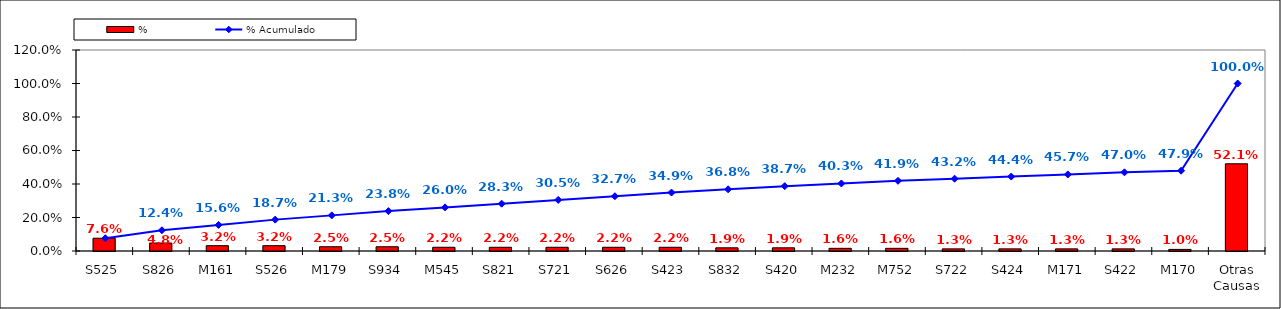
| Category | % |
|---|---|
| S525 | 0.076 |
| S826 | 0.048 |
| M161 | 0.032 |
| S526 | 0.032 |
| M179 | 0.025 |
| S934 | 0.025 |
| M545 | 0.022 |
| S821 | 0.022 |
| S721 | 0.022 |
| S626 | 0.022 |
| S423 | 0.022 |
| S832 | 0.019 |
| S420 | 0.019 |
| M232 | 0.016 |
| M752 | 0.016 |
| S722 | 0.013 |
| S424 | 0.013 |
| M171 | 0.013 |
| S422 | 0.013 |
| M170 | 0.01 |
| Otras Causas | 0.521 |